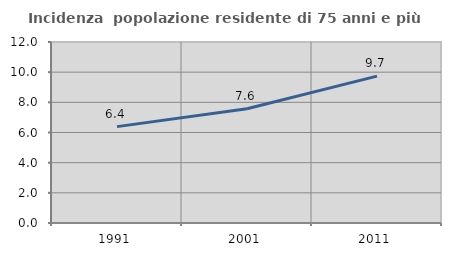
| Category | Incidenza  popolazione residente di 75 anni e più |
|---|---|
| 1991.0 | 6.39 |
| 2001.0 | 7.575 |
| 2011.0 | 9.737 |